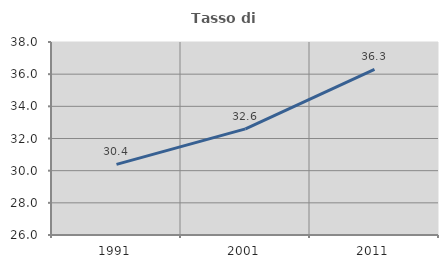
| Category | Tasso di occupazione   |
|---|---|
| 1991.0 | 30.391 |
| 2001.0 | 32.599 |
| 2011.0 | 36.3 |